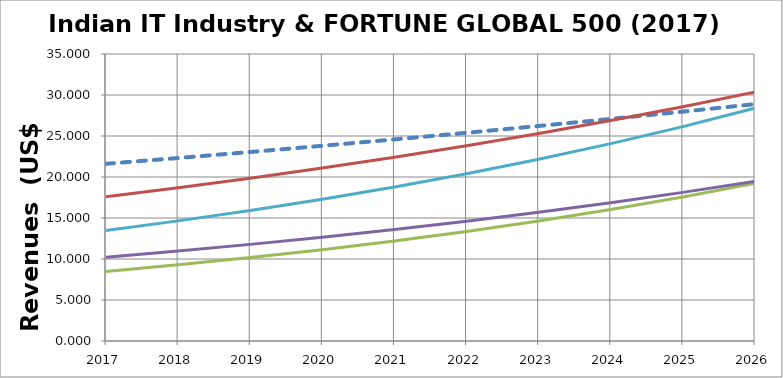
| Category | Qualifying Revenue | TCS | WIPRO | INFOSYS | COGNIZANT |
|---|---|---|---|---|---|
| 2017.0 | 21.609 | 17.58 | 8.476 | 10.208 | 13.487 |
| 2018.0 | 22.317 | 18.68 | 9.284 | 10.968 | 14.65 |
| 2019.0 | 23.049 | 19.848 | 10.17 | 11.784 | 15.914 |
| 2020.0 | 23.805 | 21.09 | 11.14 | 12.661 | 17.287 |
| 2021.0 | 24.585 | 22.409 | 12.202 | 13.603 | 18.778 |
| 2022.0 | 25.391 | 23.811 | 13.366 | 14.615 | 20.398 |
| 2023.0 | 26.224 | 25.301 | 14.641 | 15.702 | 22.157 |
| 2024.0 | 27.084 | 26.883 | 16.037 | 16.871 | 24.069 |
| 2025.0 | 27.972 | 28.565 | 17.567 | 18.126 | 26.145 |
| 2026.0 | 28.889 | 30.352 | 19.242 | 19.475 | 28.4 |